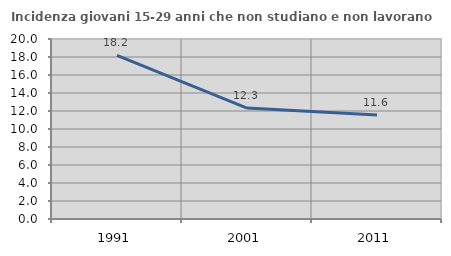
| Category | Incidenza giovani 15-29 anni che non studiano e non lavorano  |
|---|---|
| 1991.0 | 18.188 |
| 2001.0 | 12.324 |
| 2011.0 | 11.553 |